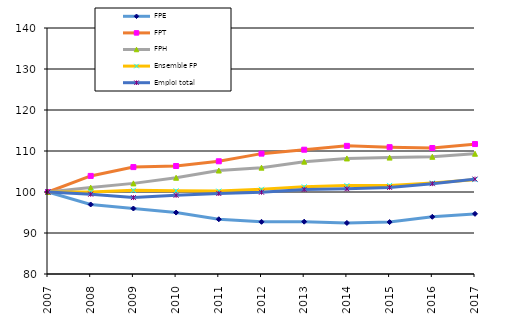
| Category | FPE | FPT | FPH | Ensemble FP | Emploi total |
|---|---|---|---|---|---|
| 2007.0 | 100 | 100 | 100 | 100 | 100 |
| 2008.0 | 96.959 | 103.922 | 101.08 | 99.994 | 99.455 |
| 2009.0 | 95.972 | 106.073 | 102.102 | 100.406 | 98.637 |
| 2010.0 | 94.981 | 106.34 | 103.477 | 100.287 | 99.192 |
| 2011.0 | 93.351 | 107.493 | 105.236 | 100.219 | 99.632 |
| 2012.0 | 92.732 | 109.357 | 105.94 | 100.653 | 99.943 |
| 2013.0 | 92.761 | 110.316 | 107.405 | 101.264 | 100.626 |
| 2014.0 | 92.451 | 111.25 | 108.185 | 101.567 | 100.765 |
| 2015.0 | 92.661 | 110.936 | 108.39 | 101.61 | 101.119 |
| 2016.0 | 93.956 | 110.734 | 108.588 | 102.21 | 102.039 |
| 2017.0 | 94.679 | 111.695 | 109.334 | 103.013 | 103.148 |